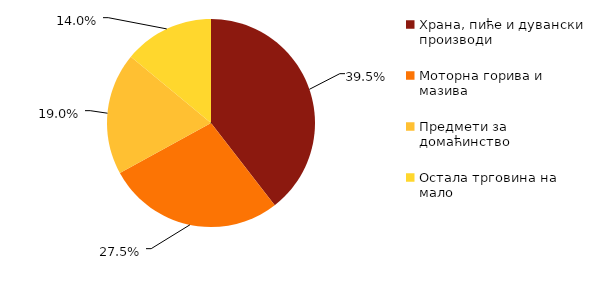
| Category | Учешће у промету  |
|---|---|
| Храна, пиће и дувански производи | 39.5 |
| Моторна горива и мазива | 27.5 |
| Предмети за домаћинство | 19 |
| Остала трговина на мало | 14 |